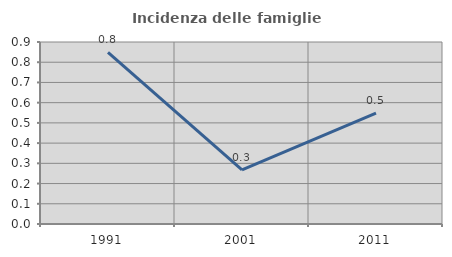
| Category | Incidenza delle famiglie numerose |
|---|---|
| 1991.0 | 0.849 |
| 2001.0 | 0.267 |
| 2011.0 | 0.548 |